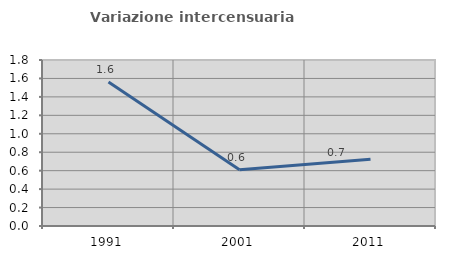
| Category | Variazione intercensuaria annua |
|---|---|
| 1991.0 | 1.561 |
| 2001.0 | 0.61 |
| 2011.0 | 0.723 |